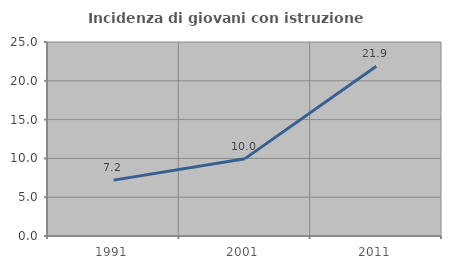
| Category | Incidenza di giovani con istruzione universitaria |
|---|---|
| 1991.0 | 7.199 |
| 2001.0 | 9.968 |
| 2011.0 | 21.869 |